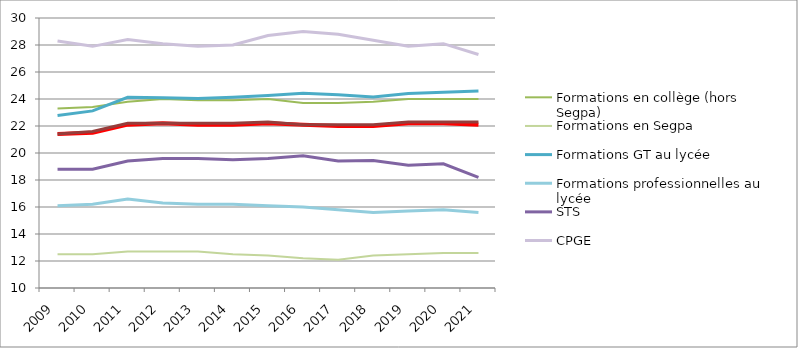
| Category | Formations en collège (hors Segpa) | Formations en Segpa | Formations GT au lycée | Formations professionnelles au lycée | STS | CPGE | Total établissements du 2d degré | Total 2d degré |
|---|---|---|---|---|---|---|---|---|
| 2009.0 | 23.3 | 12.5 | 22.78 | 16.1 | 18.8 | 28.3 | 21.4 | 21.4 |
| 2010.0 | 23.4 | 12.5 | 23.12 | 16.2 | 18.8 | 27.9 | 21.5 | 21.6 |
| 2011.0 | 23.8 | 12.7 | 24.13 | 16.6 | 19.4 | 28.4 | 22.1 | 22.2 |
| 2012.0 | 24 | 12.7 | 24.09 | 16.3 | 19.6 | 28.1 | 22.2 | 22.2 |
| 2013.0 | 23.9 | 12.7 | 24.04 | 16.2 | 19.6 | 27.9 | 22.1 | 22.2 |
| 2014.0 | 23.9 | 12.5 | 24.13 | 16.2 | 19.5 | 28 | 22.1 | 22.2 |
| 2015.0 | 24 | 12.4 | 24.26 | 16.1 | 19.6 | 28.7 | 22.2 | 22.3 |
| 2016.0 | 23.7 | 12.2 | 24.42 | 16 | 19.8 | 29 | 22.1 | 22.1 |
| 2017.0 | 23.7 | 12.1 | 24.31 | 15.8 | 19.4 | 28.8 | 22 | 22.1 |
| 2018.0 | 23.8 | 12.4 | 24.15 | 15.6 | 19.45 | 28.35 | 22 | 22.1 |
| 2019.0 | 24 | 12.5 | 24.4 | 15.7 | 19.1 | 27.9 | 22.2 | 22.3 |
| 2020.0 | 24 | 12.6 | 24.5 | 15.8 | 19.2 | 28.1 | 22.2 | 22.3 |
| 2021.0 | 24 | 12.6 | 24.6 | 15.6 | 18.2 | 27.3 | 22.1 | 22.3 |